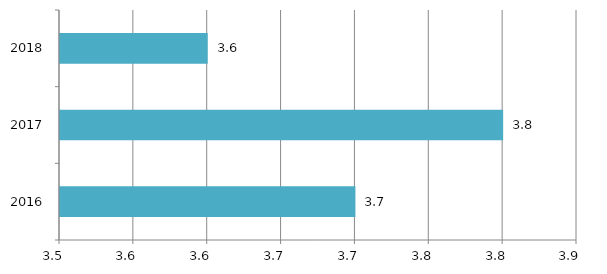
| Category | Series 0 |
|---|---|
| 2016.0 | 3.7 |
| 2017.0 | 3.8 |
| 2018.0 | 3.6 |